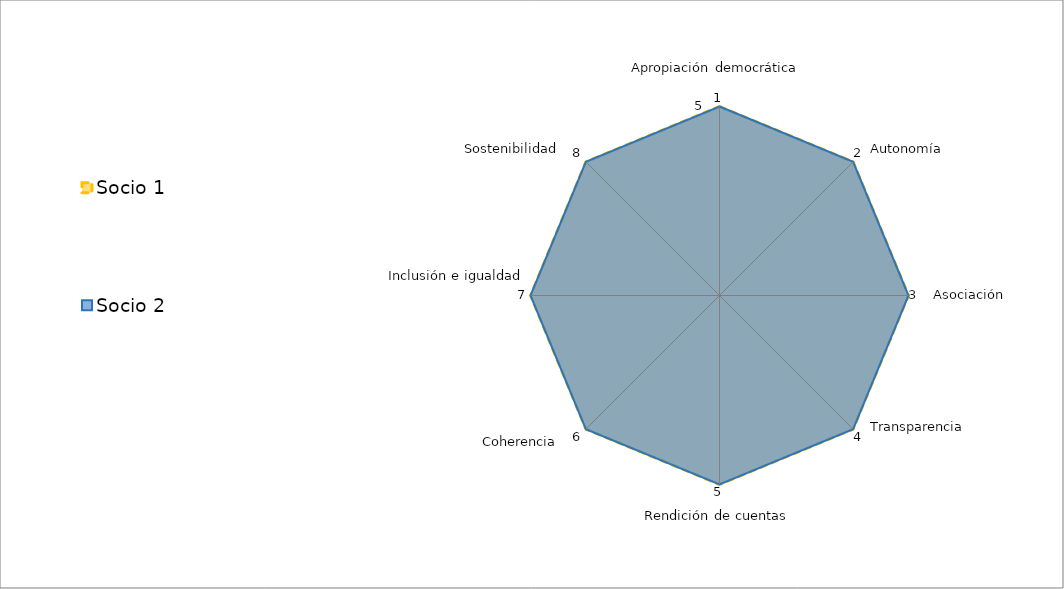
| Category | Socio 1 | Socio 2 |
|---|---|---|
| 0 | 5 | 5 |
| 1 | 5 | 5 |
| 2 | 5 | 5 |
| 3 | 5 | 5 |
| 4 | 5 | 5 |
| 5 | 5 | 5 |
| 6 | 5 | 5 |
| 7 | 5 | 5 |